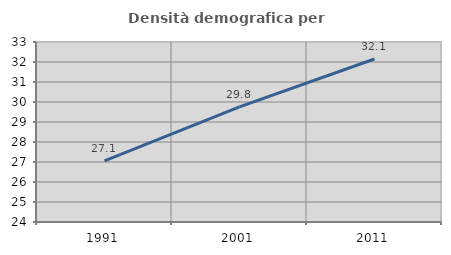
| Category | Densità demografica |
|---|---|
| 1991.0 | 27.052 |
| 2001.0 | 29.759 |
| 2011.0 | 32.15 |